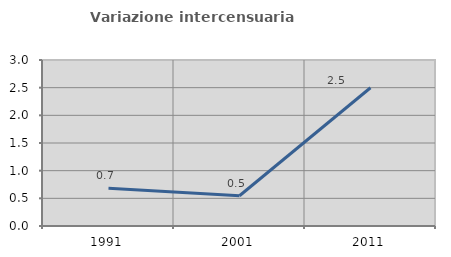
| Category | Variazione intercensuaria annua |
|---|---|
| 1991.0 | 0.682 |
| 2001.0 | 0.547 |
| 2011.0 | 2.499 |